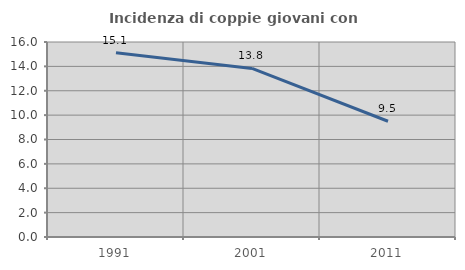
| Category | Incidenza di coppie giovani con figli |
|---|---|
| 1991.0 | 15.126 |
| 2001.0 | 13.834 |
| 2011.0 | 9.496 |